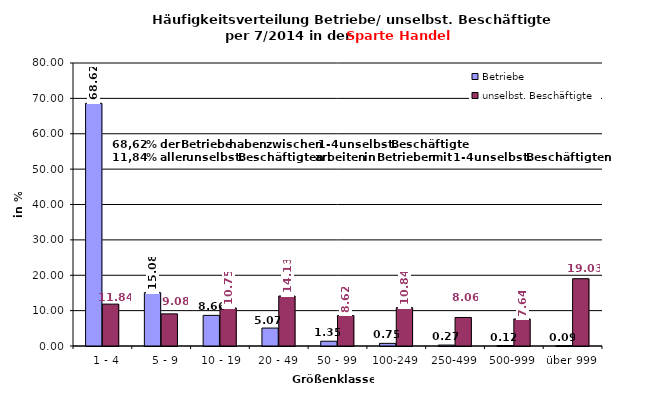
| Category | Betriebe | unselbst. Beschäftigte |
|---|---|---|
|   1 - 4 | 68.615 | 11.839 |
|   5 - 9 | 15.078 | 9.084 |
|  10 - 19 | 8.66 | 10.751 |
| 20 - 49 | 5.067 | 14.131 |
| 50 - 99 | 1.351 | 8.624 |
| 100-249 | 0.747 | 10.836 |
| 250-499 | 0.266 | 8.064 |
| 500-999 | 0.123 | 7.643 |
| über 999 | 0.092 | 19.027 |